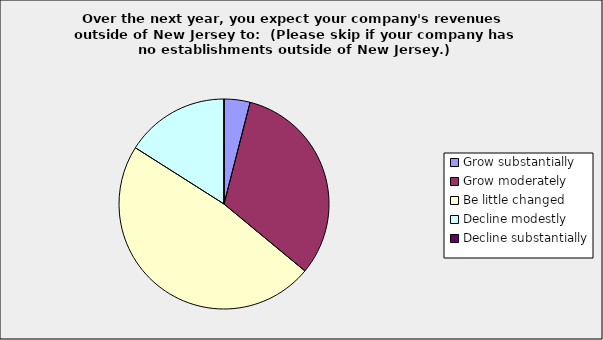
| Category | Series 0 |
|---|---|
| Grow substantially | 0.04 |
| Grow moderately | 0.32 |
| Be little changed | 0.48 |
| Decline modestly | 0.16 |
| Decline substantially | 0 |